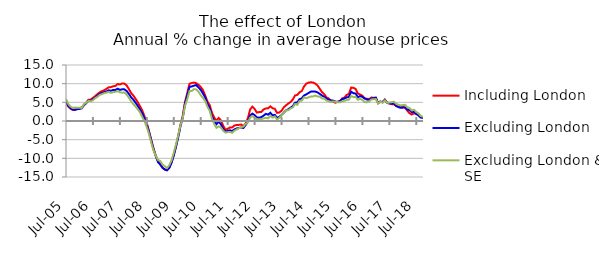
| Category | Including London | Excluding London | Excluding London & SE |
|---|---|---|---|
| 2005-07-01 | 4.929 | 5.234 | 5.912 |
| 2005-08-01 | 3.904 | 4.11 | 4.579 |
| 2005-09-01 | 3.307 | 3.467 | 3.845 |
| 2005-10-01 | 2.983 | 3.057 | 3.504 |
| 2005-11-01 | 2.97 | 3.027 | 3.61 |
| 2005-12-01 | 3.282 | 3.163 | 3.554 |
| 2006-01-01 | 3.392 | 3.23 | 3.526 |
| 2006-02-01 | 3.661 | 3.384 | 3.507 |
| 2006-03-01 | 4.324 | 4.241 | 4.508 |
| 2006-04-01 | 4.937 | 4.745 | 4.889 |
| 2006-05-01 | 5.692 | 5.5 | 5.409 |
| 2006-06-01 | 5.74 | 5.391 | 5.297 |
| 2006-07-01 | 6.189 | 5.833 | 5.562 |
| 2006-08-01 | 6.652 | 6.246 | 6.111 |
| 2006-09-01 | 7.224 | 6.766 | 6.471 |
| 2006-10-01 | 7.66 | 7.279 | 6.993 |
| 2006-11-01 | 7.994 | 7.519 | 7.201 |
| 2006-12-01 | 8.229 | 7.714 | 7.454 |
| 2007-01-01 | 8.608 | 7.898 | 7.611 |
| 2007-02-01 | 9.011 | 8.213 | 7.807 |
| 2007-03-01 | 9.08 | 8.094 | 7.535 |
| 2007-04-01 | 9.295 | 8.304 | 7.716 |
| 2007-05-01 | 9.388 | 8.306 | 7.832 |
| 2007-06-01 | 9.907 | 8.66 | 7.966 |
| 2007-07-01 | 9.788 | 8.343 | 7.697 |
| 2007-08-01 | 10.057 | 8.482 | 7.582 |
| 2007-09-01 | 10.004 | 8.485 | 7.621 |
| 2007-10-01 | 9.547 | 8.05 | 7.097 |
| 2007-11-01 | 8.556 | 7.262 | 6.242 |
| 2007-12-01 | 7.513 | 6.355 | 5.285 |
| 2008-01-01 | 6.804 | 5.702 | 4.489 |
| 2008-02-01 | 5.949 | 4.882 | 3.861 |
| 2008-03-01 | 4.981 | 4.03 | 3.108 |
| 2008-04-01 | 3.926 | 3.04 | 2.268 |
| 2008-05-01 | 2.778 | 1.996 | 1.026 |
| 2008-06-01 | 1.183 | 0.603 | -0.123 |
| 2008-07-01 | -0.603 | -0.964 | -1.66 |
| 2008-08-01 | -2.766 | -3.011 | -3.518 |
| 2008-09-01 | -5.136 | -5.317 | -5.868 |
| 2008-10-01 | -7.399 | -7.61 | -7.927 |
| 2008-11-01 | -9.296 | -9.441 | -9.326 |
| 2008-12-01 | -10.78 | -11.022 | -10.45 |
| 2009-01-01 | -11.611 | -11.692 | -10.714 |
| 2009-02-01 | -12.508 | -12.526 | -11.659 |
| 2009-03-01 | -13.003 | -12.983 | -12.112 |
| 2009-04-01 | -13.206 | -13.181 | -12.62 |
| 2009-05-01 | -12.458 | -12.581 | -11.826 |
| 2009-06-01 | -11.081 | -11.188 | -10.551 |
| 2009-07-01 | -9.049 | -9.241 | -8.491 |
| 2009-08-01 | -6.731 | -6.878 | -6.239 |
| 2009-09-01 | -3.878 | -4.304 | -3.732 |
| 2009-10-01 | -0.95 | -1.35 | -1.078 |
| 2009-11-01 | 1.436 | 0.841 | 0.812 |
| 2009-12-01 | 5.087 | 4.677 | 4.051 |
| 2010-01-01 | 7.476 | 6.847 | 5.855 |
| 2010-02-01 | 9.957 | 9.158 | 8.026 |
| 2010-03-01 | 10.187 | 9.249 | 8.046 |
| 2010-04-01 | 10.293 | 9.464 | 8.539 |
| 2010-05-01 | 10.134 | 9.636 | 8.443 |
| 2010-06-01 | 9.686 | 8.974 | 7.819 |
| 2010-07-01 | 9.13 | 8.344 | 6.927 |
| 2010-08-01 | 8.277 | 7.375 | 6.148 |
| 2010-09-01 | 6.825 | 6.297 | 5.38 |
| 2010-10-01 | 5.198 | 4.562 | 3.81 |
| 2010-11-01 | 4.242 | 3.499 | 2.719 |
| 2010-12-01 | 2.222 | 1.247 | 0.588 |
| 2011-01-01 | 0.939 | 0.042 | -0.777 |
| 2011-02-01 | 0.059 | -0.86 | -1.827 |
| 2011-03-01 | 0.819 | -0.208 | -1.448 |
| 2011-04-01 | 0.169 | -0.876 | -1.735 |
| 2011-05-01 | -1.249 | -2.089 | -2.594 |
| 2011-06-01 | -2.327 | -2.799 | -3.113 |
| 2011-07-01 | -2.111 | -2.68 | -2.984 |
| 2011-08-01 | -1.734 | -2.479 | -2.912 |
| 2011-09-01 | -1.719 | -2.708 | -3.153 |
| 2011-10-01 | -1.214 | -2.257 | -2.603 |
| 2011-11-01 | -1.069 | -1.996 | -2.263 |
| 2011-12-01 | -1.035 | -1.886 | -1.981 |
| 2012-01-01 | -0.955 | -1.72 | -1.646 |
| 2012-02-01 | -1.387 | -1.875 | -1.499 |
| 2012-03-01 | -0.651 | -1.096 | -0.794 |
| 2012-04-01 | 0.731 | -0.125 | -0.376 |
| 2012-05-01 | 3.09 | 1.481 | 0.883 |
| 2012-06-01 | 3.853 | 1.977 | 1.347 |
| 2012-07-01 | 3.236 | 1.571 | 0.934 |
| 2012-08-01 | 2.256 | 0.937 | 0.481 |
| 2012-09-01 | 2.394 | 0.888 | 0.351 |
| 2012-10-01 | 2.437 | 1.034 | 0.539 |
| 2012-11-01 | 3.088 | 1.426 | 0.672 |
| 2012-12-01 | 3.374 | 1.912 | 0.837 |
| 2013-01-01 | 3.401 | 1.699 | 0.715 |
| 2013-02-01 | 3.923 | 2.206 | 1.359 |
| 2013-03-01 | 3.418 | 1.52 | 0.906 |
| 2013-04-01 | 3.278 | 1.644 | 1.225 |
| 2013-05-01 | 2.166 | 0.851 | 0.404 |
| 2013-06-01 | 2.285 | 1.099 | 0.851 |
| 2013-07-01 | 2.753 | 1.602 | 1.473 |
| 2013-08-01 | 3.667 | 2.247 | 2.226 |
| 2013-09-01 | 4.2 | 2.86 | 2.912 |
| 2013-10-01 | 4.672 | 3.129 | 2.875 |
| 2013-11-01 | 5.097 | 3.584 | 3.376 |
| 2013-12-01 | 5.734 | 3.954 | 3.609 |
| 2014-01-01 | 6.843 | 4.907 | 4.542 |
| 2014-02-01 | 6.983 | 4.965 | 4.317 |
| 2014-03-01 | 7.681 | 5.847 | 5.343 |
| 2014-04-01 | 8.001 | 6.044 | 5.45 |
| 2014-05-01 | 9.211 | 6.845 | 6.326 |
| 2014-06-01 | 9.998 | 7.125 | 6.115 |
| 2014-07-01 | 10.284 | 7.494 | 6.334 |
| 2014-08-01 | 10.371 | 7.86 | 6.56 |
| 2014-09-01 | 10.314 | 7.927 | 6.564 |
| 2014-10-01 | 10.032 | 7.894 | 6.813 |
| 2014-11-01 | 9.522 | 7.679 | 6.573 |
| 2014-12-01 | 8.631 | 7.277 | 6.549 |
| 2015-01-01 | 7.731 | 6.813 | 6.058 |
| 2015-02-01 | 7.186 | 6.505 | 6.026 |
| 2015-03-01 | 6.343 | 5.977 | 5.483 |
| 2015-04-01 | 6.022 | 5.732 | 5.304 |
| 2015-05-01 | 5.4 | 5.522 | 5.107 |
| 2015-06-01 | 5.119 | 5.447 | 5.233 |
| 2015-07-01 | 4.895 | 5.208 | 5.134 |
| 2015-08-01 | 5.145 | 5.128 | 5.054 |
| 2015-09-01 | 5.313 | 5.319 | 4.994 |
| 2015-10-01 | 6.033 | 5.873 | 5.273 |
| 2015-11-01 | 6.276 | 5.999 | 5.404 |
| 2015-12-01 | 6.992 | 6.339 | 5.631 |
| 2016-01-01 | 7.254 | 6.427 | 5.715 |
| 2016-02-01 | 8.952 | 7.83 | 6.69 |
| 2016-03-01 | 8.888 | 7.448 | 6.427 |
| 2016-04-01 | 8.591 | 7.359 | 6.427 |
| 2016-05-01 | 7.371 | 6.358 | 5.693 |
| 2016-06-01 | 7.084 | 6.666 | 5.925 |
| 2016-07-01 | 6.779 | 6.463 | 5.632 |
| 2016-08-01 | 6.064 | 6.038 | 5.085 |
| 2016-09-01 | 5.961 | 5.746 | 5.002 |
| 2016-10-01 | 5.857 | 5.668 | 5.238 |
| 2016-11-01 | 6.276 | 6.026 | 5.773 |
| 2016-12-01 | 6.236 | 6.126 | 5.849 |
| 2017-01-01 | 6.238 | 6.242 | 5.867 |
| 2017-02-01 | 4.745 | 4.86 | 4.737 |
| 2017-03-01 | 5.114 | 5.241 | 5.166 |
| 2017-04-01 | 5.076 | 5.01 | 4.909 |
| 2017-05-01 | 5.736 | 5.655 | 5.503 |
| 2017-06-01 | 4.953 | 4.822 | 4.835 |
| 2017-07-01 | 4.719 | 4.727 | 4.941 |
| 2017-08-01 | 4.514 | 4.673 | 5.039 |
| 2017-09-01 | 4.502 | 4.65 | 5.171 |
| 2017-10-01 | 4.038 | 4.057 | 4.598 |
| 2017-11-01 | 3.86 | 3.746 | 4.397 |
| 2017-12-01 | 3.832 | 3.525 | 4.166 |
| 2018-01-01 | 3.819 | 3.568 | 4.275 |
| 2018-02-01 | 3.618 | 3.642 | 4.331 |
| 2018-03-01 | 2.741 | 3.079 | 3.677 |
| 2018-04-01 | 2.085 | 2.924 | 3.434 |
| 2018-05-01 | 1.727 | 2.339 | 2.833 |
| 2018-06-01 | 2.064 | 2.511 | 3.014 |
| 2018-07-01 | 1.946 | 1.861 | 2.424 |
| 2018-08-01 | 1.869 | 1.51 | 2.049 |
| 2018-09-01 | 1.118 | 0.91 | 1.33 |
| 2018-10-01 | 1.017 | 0.848 | 1.13 |